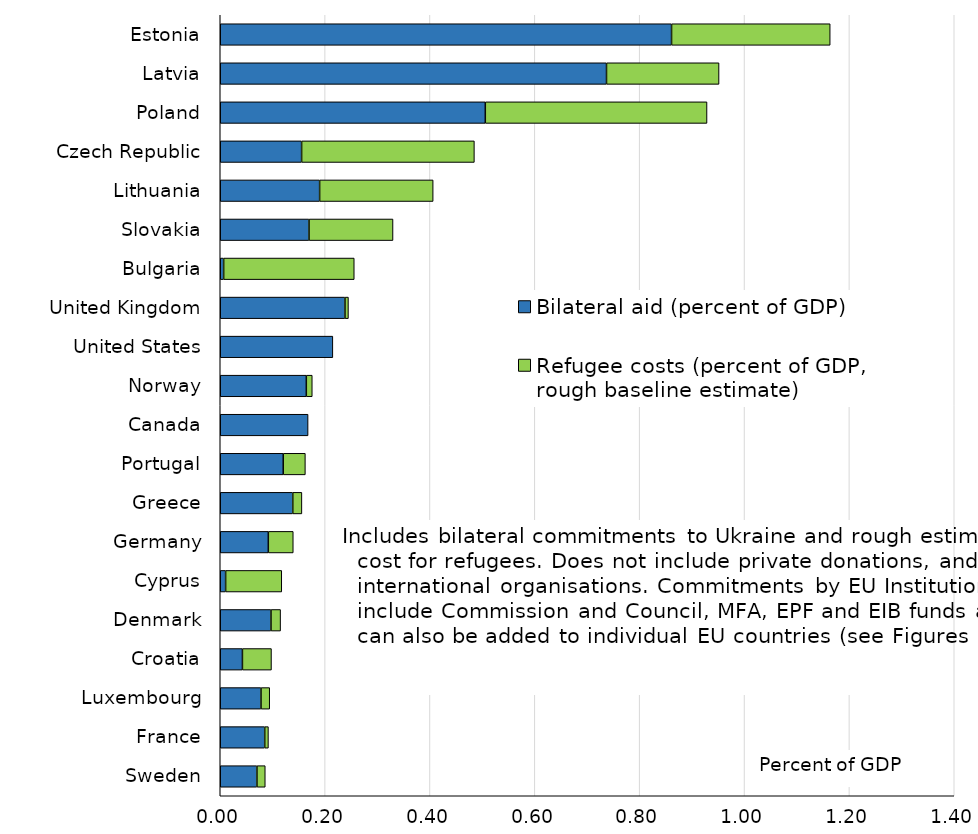
| Category | Bilateral aid (percent of GDP) | Refugee costs (percent of GDP, rough baseline estimate) |
|---|---|---|
| Estonia | 0.861 | 0.303 |
| Latvia | 0.737 | 0.215 |
| Poland | 0.506 | 0.423 |
| Czech Republic | 0.155 | 0.33 |
| Lithuania | 0.19 | 0.217 |
| Slovakia | 0.169 | 0.16 |
| Bulgaria | 0.007 | 0.249 |
| United Kingdom | 0.238 | 0.007 |
| United States | 0.215 | 0 |
| Norway | 0.164 | 0.011 |
| Canada | 0.168 | 0 |
| Portugal | 0.12 | 0.042 |
| Greece | 0.138 | 0.017 |
| Germany | 0.092 | 0.048 |
| Cyprus | 0.01 | 0.107 |
| Denmark | 0.097 | 0.018 |
| Croatia | 0.042 | 0.055 |
| Luxembourg | 0.078 | 0.017 |
| France | 0.085 | 0.007 |
| Sweden | 0.07 | 0.016 |